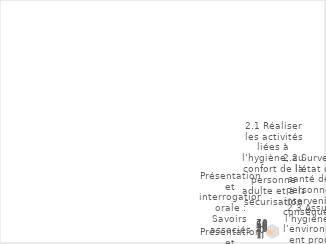
| Category | % |
|---|---|
| 0 | 0.1 |
| 1 | 0.35 |
| 2 | 0.1 |
| 3 | 0.35 |
| 4 | 0.525 |
| 5 | 0.7 |